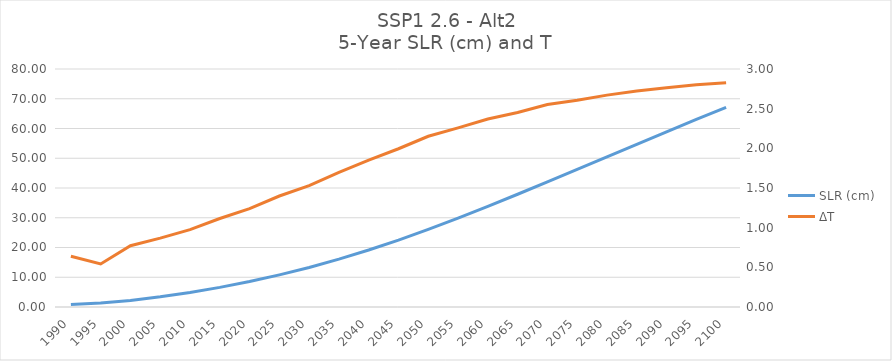
| Category | SLR (cm) |
|---|---|
| 1990.0 | 0.851 |
| 1995.0 | 1.315 |
| 2000.0 | 2.215 |
| 2005.0 | 3.412 |
| 2010.0 | 4.865 |
| 2015.0 | 6.592 |
| 2020.0 | 8.555 |
| 2025.0 | 10.811 |
| 2030.0 | 13.299 |
| 2035.0 | 16.096 |
| 2040.0 | 19.172 |
| 2045.0 | 22.503 |
| 2050.0 | 26.119 |
| 2055.0 | 29.899 |
| 2060.0 | 33.85 |
| 2065.0 | 37.895 |
| 2070.0 | 42.072 |
| 2075.0 | 46.261 |
| 2080.0 | 50.482 |
| 2085.0 | 54.7 |
| 2090.0 | 58.889 |
| 2095.0 | 63.036 |
| 2100.0 | 67.105 |